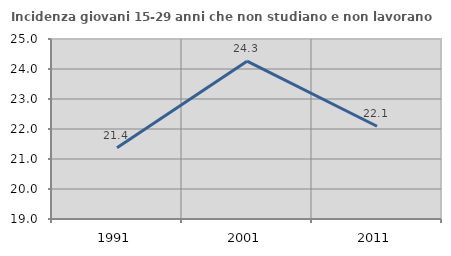
| Category | Incidenza giovani 15-29 anni che non studiano e non lavorano  |
|---|---|
| 1991.0 | 21.375 |
| 2001.0 | 24.26 |
| 2011.0 | 22.091 |